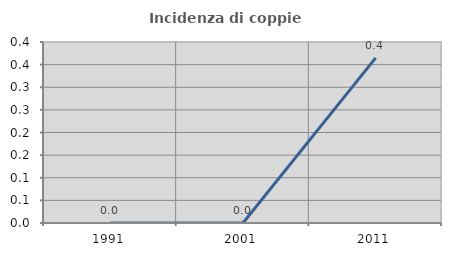
| Category | Incidenza di coppie miste |
|---|---|
| 1991.0 | 0 |
| 2001.0 | 0 |
| 2011.0 | 0.365 |